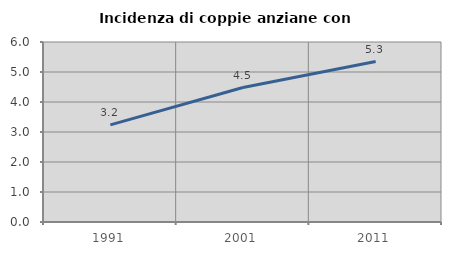
| Category | Incidenza di coppie anziane con figli |
|---|---|
| 1991.0 | 3.239 |
| 2001.0 | 4.481 |
| 2011.0 | 5.348 |